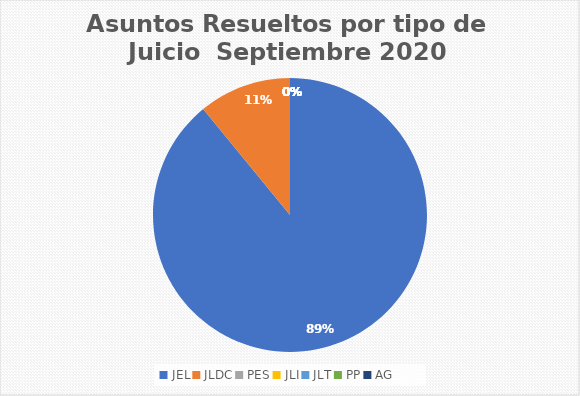
| Category | Asuntos Resueltos por tipo de Juicio  Septiembre |
|---|---|
| JEL | 163 |
| JLDC | 20 |
| PES | 0 |
| JLI | 0 |
| JLT | 0 |
| PP | 0 |
| AG | 0 |